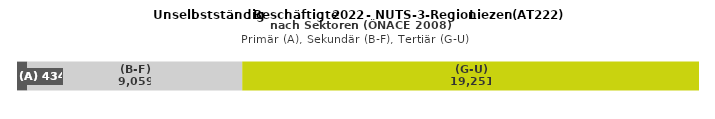
| Category | (A) | (B-F) | (G-U) |
|---|---|---|---|
| 0 | 434 | 9059 | 19251 |